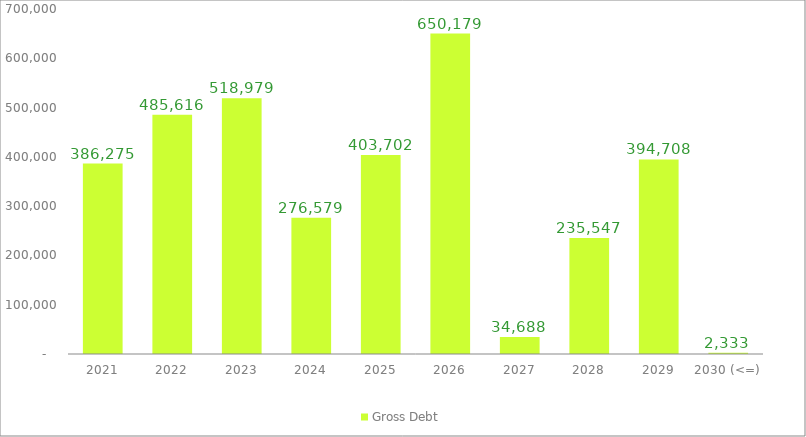
| Category | Gross Debt |
|---|---|
| 2021 | 386274.716 |
| 2022 | 485616.395 |
| 2023 | 518979.094 |
| 2024 | 276578.622 |
| 2025 | 403701.99 |
| 2026 | 650178.568 |
| 2027 | 34687.87 |
| 2028 | 235547.198 |
| 2029 | 394708.463 |
| 2030 (<=) | 2332.913 |